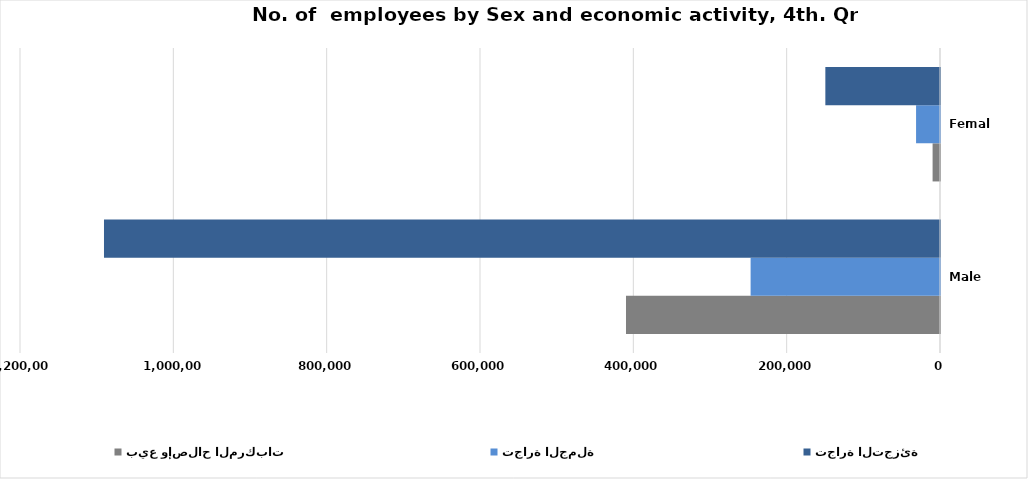
| Category | بيع وإصلاح المركبات  | تجارة الجملة | تجارة التجزئة |
|---|---|---|---|
| Male | 409569 | 247028 | 1090452 |
| Female | 9662 | 31214 | 149543 |